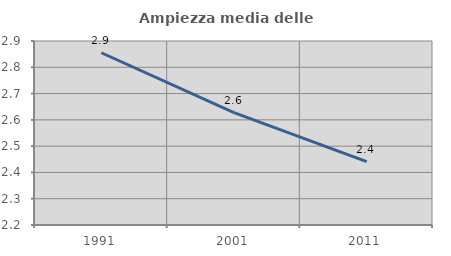
| Category | Ampiezza media delle famiglie |
|---|---|
| 1991.0 | 2.855 |
| 2001.0 | 2.627 |
| 2011.0 | 2.441 |